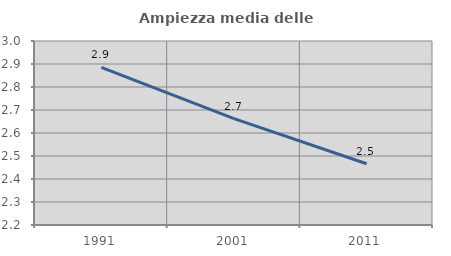
| Category | Ampiezza media delle famiglie |
|---|---|
| 1991.0 | 2.885 |
| 2001.0 | 2.662 |
| 2011.0 | 2.466 |